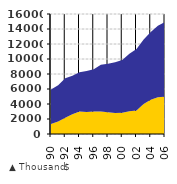
| Category | Tuition & Fees | Room & Board |
|---|---|---|
| 90 | 1318.792 | 4602.376 |
| 91 | 1657.573 | 4839.406 |
| 92 | 2182.397 | 5255.524 |
| 93 | 2634.844 | 5118.349 |
| 94 | 3009.313 | 5236.337 |
| 95 | 2940.613 | 5445.302 |
| 96 | 3013.875 | 5619.286 |
| 97 | 3009.583 | 6210.464 |
| 98 | 2904.241 | 6447.264 |
| 99 | 2812.2 | 6753.282 |
| 00 | 2838.992 | 7037.45 |
| 01 | 3044.916 | 7651.009 |
| 02 | 3120.08 | 8217.85 |
| 03 | 3990.003 | 8617.618 |
| 04 | 4551.176 | 9039.72 |
| 05 | 4913.281 | 9517.885 |
| 06 | 4959.428 | 9985.785 |